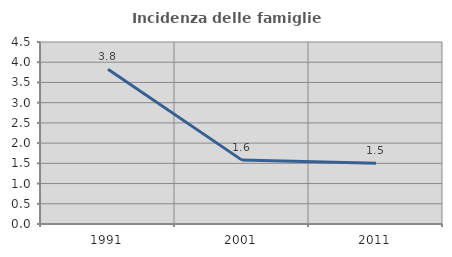
| Category | Incidenza delle famiglie numerose |
|---|---|
| 1991.0 | 3.825 |
| 2001.0 | 1.579 |
| 2011.0 | 1.5 |